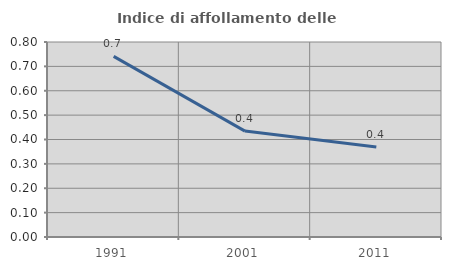
| Category | Indice di affollamento delle abitazioni  |
|---|---|
| 1991.0 | 0.741 |
| 2001.0 | 0.434 |
| 2011.0 | 0.369 |